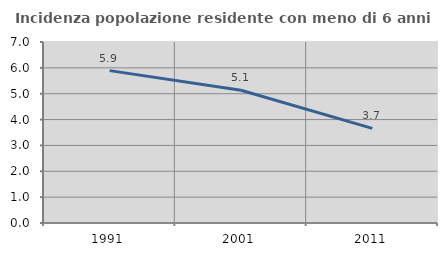
| Category | Incidenza popolazione residente con meno di 6 anni |
|---|---|
| 1991.0 | 5.893 |
| 2001.0 | 5.136 |
| 2011.0 | 3.66 |